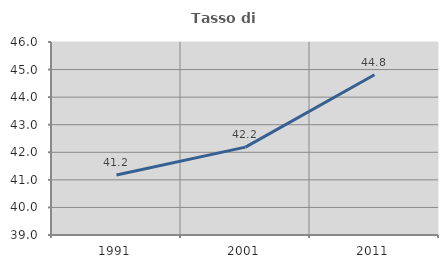
| Category | Tasso di occupazione   |
|---|---|
| 1991.0 | 41.177 |
| 2001.0 | 42.188 |
| 2011.0 | 44.814 |